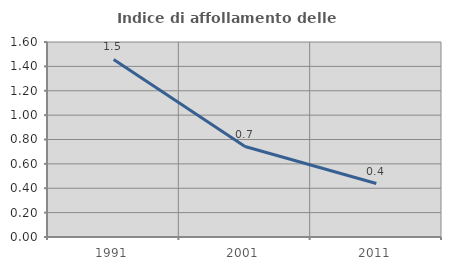
| Category | Indice di affollamento delle abitazioni  |
|---|---|
| 1991.0 | 1.457 |
| 2001.0 | 0.742 |
| 2011.0 | 0.439 |